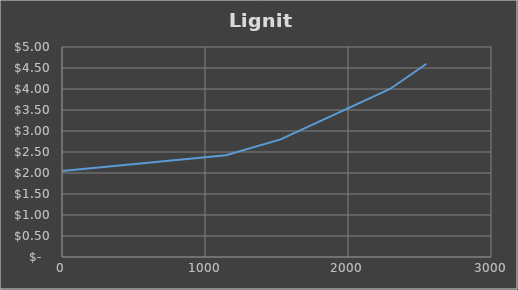
| Category | Series 0 |
|---|---|
| 0.0 | 2.05 |
| 1146.75 | 2.425 |
| 1529.0 | 2.8 |
| 2294.0 | 4 |
| 2549.0 | 4.6 |